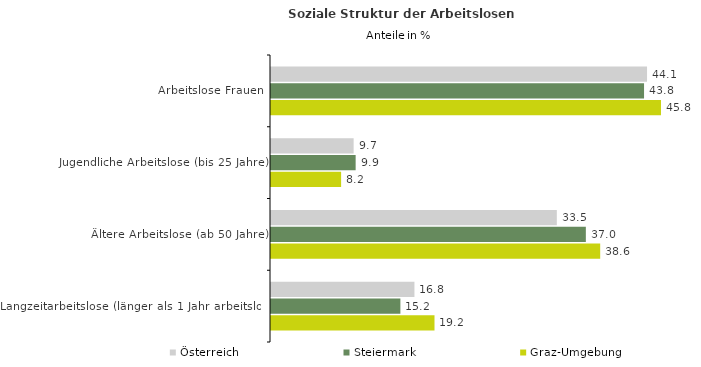
| Category | Österreich | Steiermark | Graz-Umgebung |
|---|---|---|---|
| Arbeitslose Frauen | 44.136 | 43.785 | 45.773 |
| Jugendliche Arbeitslose (bis 25 Jahre) | 9.698 | 9.935 | 8.229 |
| Ältere Arbeitslose (ab 50 Jahre) | 33.548 | 36.954 | 38.637 |
| Langzeitarbeitslose (länger als 1 Jahr arbeitslos) | 16.836 | 15.186 | 19.19 |